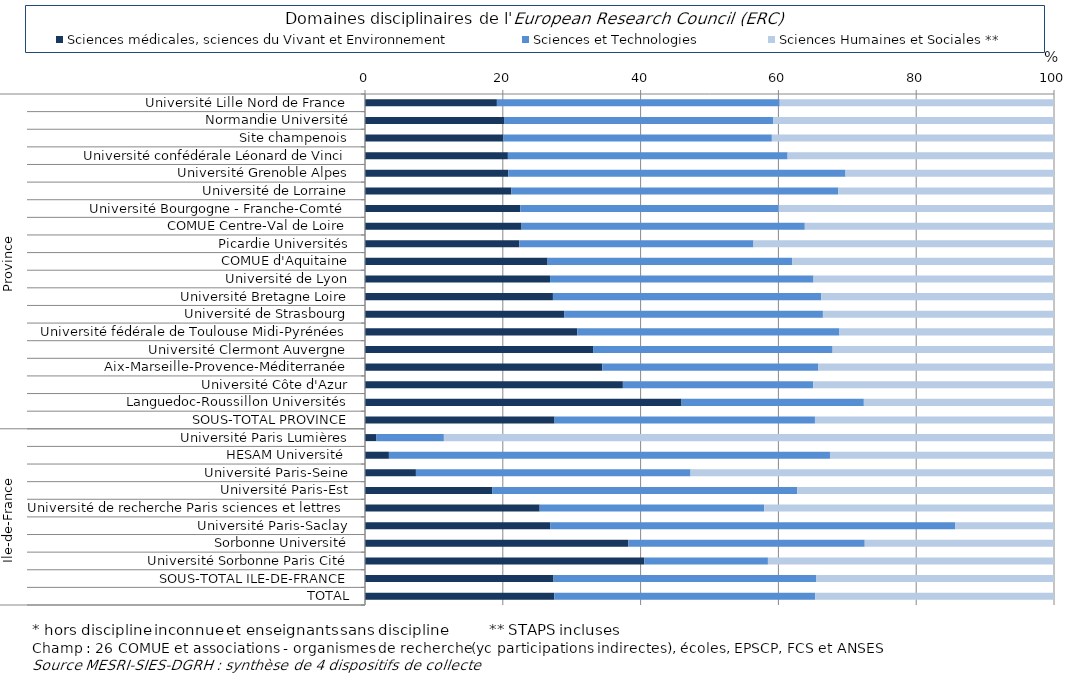
| Category | Sciences médicales, sciences du Vivant et Environnement | Sciences et Technologies | Sciences Humaines et Sociales ** |
|---|---|---|---|
| 0 | 19.142 | 41.048 | 39.81 |
| 1 | 20.179 | 39.045 | 40.776 |
| 2 | 20.09 | 38.961 | 40.949 |
| 3 | 20.74 | 40.597 | 38.662 |
| 4 | 20.803 | 48.939 | 30.258 |
| 5 | 21.253 | 47.419 | 31.328 |
| 6 | 22.548 | 37.501 | 39.951 |
| 7 | 22.724 | 41.108 | 36.169 |
| 8 | 22.41 | 33.973 | 43.617 |
| 9 | 26.501 | 35.483 | 38.016 |
| 10 | 26.859 | 38.238 | 34.902 |
| 11 | 27.275 | 38.949 | 33.776 |
| 12 | 28.896 | 37.564 | 33.54 |
| 13 | 30.816 | 38.044 | 31.14 |
| 14 | 33.106 | 34.761 | 32.132 |
| 15 | 34.439 | 31.316 | 34.245 |
| 16 | 37.428 | 27.635 | 34.938 |
| 17 | 45.947 | 26.455 | 27.599 |
| 18 | 27.516 | 37.789 | 34.695 |
| 19 | 1.673 | 9.775 | 88.551 |
| 20 | 3.469 | 64.016 | 32.514 |
| 21 | 7.39 | 39.859 | 52.75 |
| 22 | 18.494 | 44.234 | 37.273 |
| 23 | 25.353 | 32.588 | 42.058 |
| 24 | 26.871 | 58.815 | 14.313 |
| 25 | 38.223 | 34.307 | 27.47 |
| 26 | 40.552 | 17.927 | 41.521 |
| 27 | 27.364 | 38.103 | 34.533 |
| 28 | 27.472 | 37.88 | 34.648 |